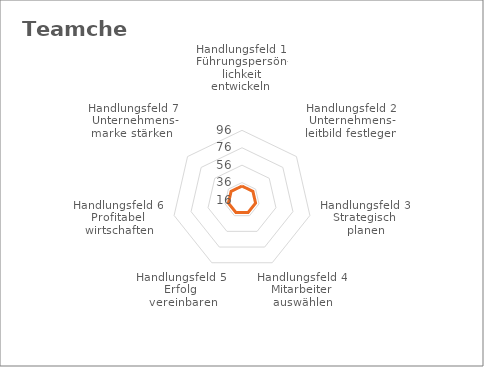
| Category | Series 0 |
|---|---|
| Handlungsfeld 1 
Führungspersön-
lichkeit entwickeln  | 0 |
| Handlungsfeld 2
Unternehmens-
leitbild festlegen | 0 |
| Handlungsfeld 3 
Strategisch 
planen | 0 |
| Handlungsfeld 4 
Mitarbeiter 
auswählen | 0 |
| Handlungsfeld 5 
Erfolg 
vereinbaren | 0 |
| Handlungsfeld 6 
Profitabel 
wirtschaften | 0 |
| Handlungsfeld 7 
Unternehmens-
marke stärken   | 0 |